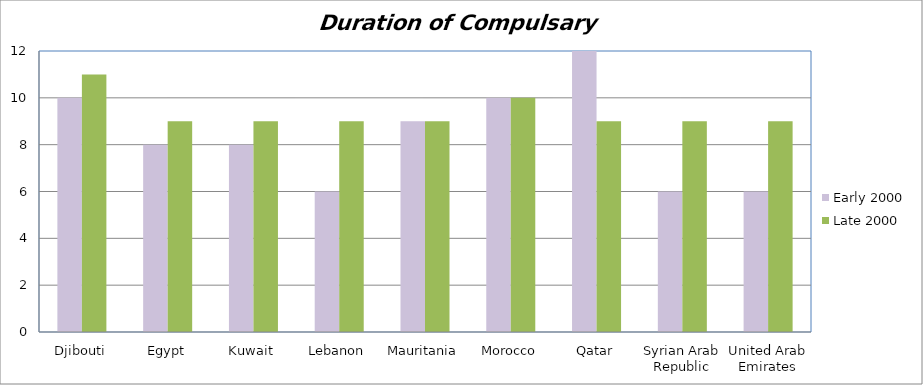
| Category | Early 2000 | Late 2000 |
|---|---|---|
| Djibouti | 10 | 11 |
| Egypt | 8 | 9 |
| Kuwait | 8 | 9 |
| Lebanon | 6 | 9 |
| Mauritania | 9 | 9 |
| Morocco | 10 | 10 |
| Qatar | 12 | 9 |
| Syrian Arab Republic | 6 | 9 |
| United Arab Emirates | 6 | 9 |